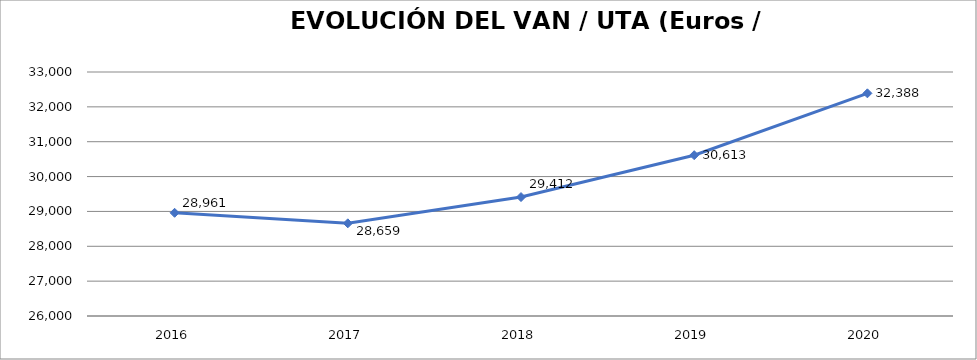
| Category | 2016 |
|---|---|
| 2016.0 | 28960.593 |
| 2017.0 | 28658.931 |
| 2018.0 | 29411.901 |
| 2019.0 | 30613.131 |
| 2020.0 | 32387.892 |